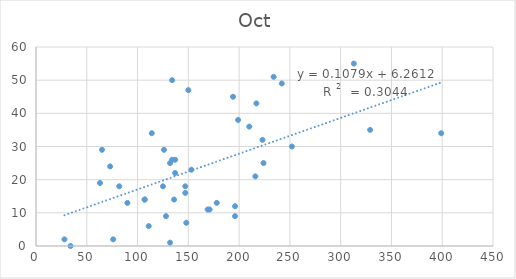
| Category | Oct |
|---|---|
| 28.0 | 2 |
| 76.0 | 2 |
| 34.0 | 0 |
| 111.0 | 6 |
| 107.0 | 14 |
| 153.0 | 23 |
| 65.0 | 29 |
| 147.0 | 18 |
| 128.0 | 9 |
| 73.0 | 24 |
| 125.0 | 18 |
| 107.0 | 14 |
| 171.0 | 11 |
| 90.0 | 13 |
| 137.0 | 22 |
| 147.0 | 16 |
| 126.0 | 29 |
| 210.0 | 36 |
| 136.0 | 14 |
| 137.0 | 26 |
| 134.0 | 50 |
| 199.0 | 38 |
| 114.0 | 34 |
| 224.0 | 25 |
| 194.0 | 45 |
| 196.0 | 12 |
| 169.0 | 11 |
| 132.0 | 25 |
| 148.0 | 7 |
| 150.0 | 47 |
| 217.0 | 43 |
| 223.0 | 32 |
| 196.0 | 9 |
| 178.0 | 13 |
| 242.0 | 49 |
| 82.0 | 18 |
| 134.0 | 26 |
| 132.0 | 1 |
| 63.0 | 19 |
| 252.0 | 30 |
| 329.0 | 35 |
| 216.0 | 21 |
| 399.0 | 34 |
| 313.0 | 55 |
| 234.0 | 51 |